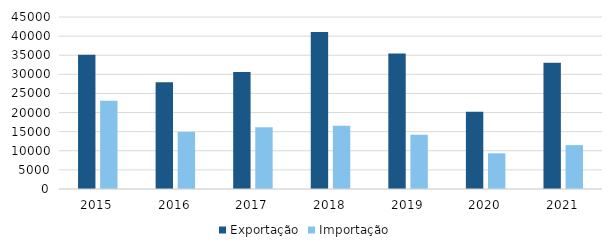
| Category | Exportação | Importação |
|---|---|---|
| 2015 | 35129.365 | 23075.427 |
| 2016 | 27909.07 | 14939.512 |
| 2017 | 30601.807 | 16134.362 |
| 2018 | 41067.127 | 16553.045 |
| 2019 | 35469.55 | 14163.164 |
| 2020 | 20232.438 | 9340.266 |
| 2021 | 33040.336 | 11478.842 |